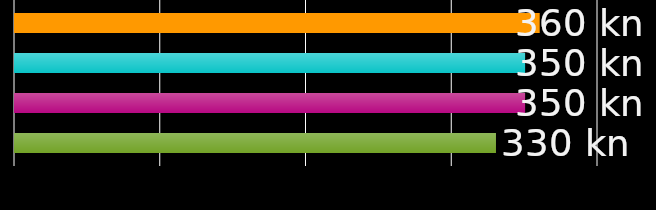
| Category | sustanar 1 | sustanar 2 | sustanar 3 | sustanar 4 |
|---|---|---|---|---|
| 0 | 360 | 350 | 350 | 330 |